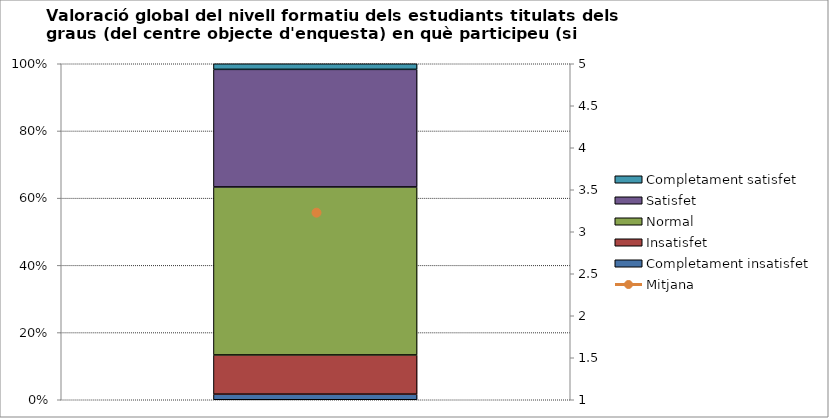
| Category | Completament insatisfet | Insatisfet | Normal | Satisfet | Completament satisfet |
|---|---|---|---|---|---|
| 0 | 1 | 7 | 30 | 21 | 1 |